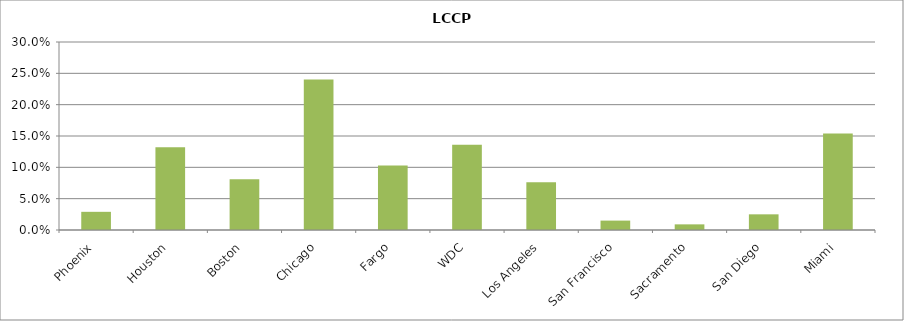
| Category | Series 0 |
|---|---|
| Phoenix | 0.029 |
| Houston | 0.132 |
| Boston | 0.081 |
| Chicago | 0.24 |
| Fargo | 0.103 |
| WDC | 0.136 |
| Los Angeles | 0.076 |
| San Francisco | 0.015 |
| Sacramento | 0.009 |
| San Diego | 0.025 |
| Miami | 0.154 |